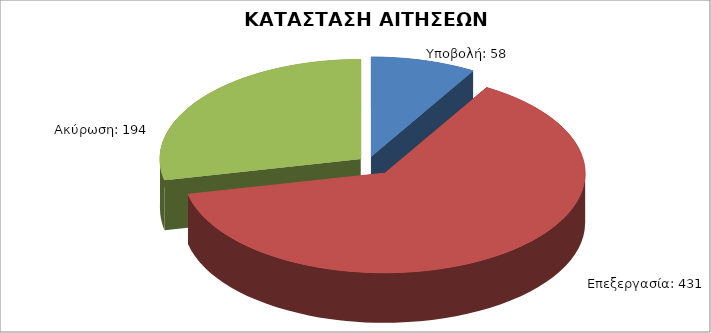
| Category | Series 0 |
|---|---|
| Υποβολή: | 58 |
| Επεξεργασία: | 431 |
| Ακύρωση: | 194 |